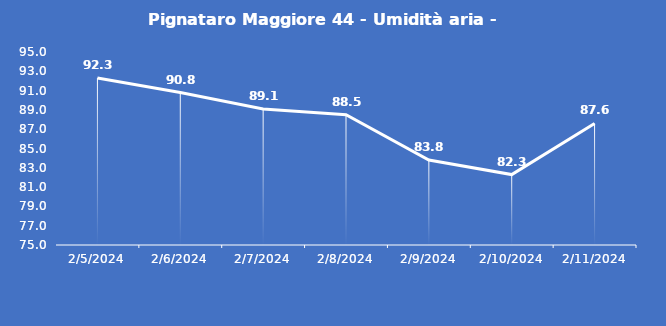
| Category | Pignataro Maggiore 44 - Umidità aria - Grezzo (%) |
|---|---|
| 2/5/24 | 92.3 |
| 2/6/24 | 90.8 |
| 2/7/24 | 89.1 |
| 2/8/24 | 88.5 |
| 2/9/24 | 83.8 |
| 2/10/24 | 82.3 |
| 2/11/24 | 87.6 |